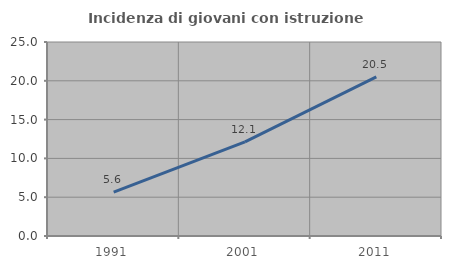
| Category | Incidenza di giovani con istruzione universitaria |
|---|---|
| 1991.0 | 5.643 |
| 2001.0 | 12.121 |
| 2011.0 | 20.501 |